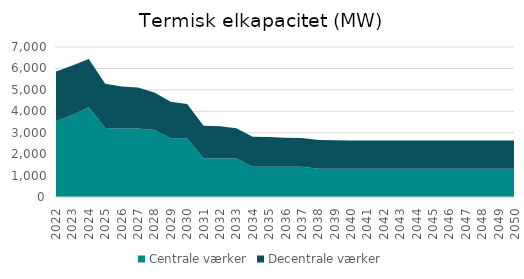
| Category | Centrale værker | Decentrale værker |
|---|---|---|
| 2022.0 | 3537.5 | 2320.3 |
| 2023.0 | 3832.5 | 2301.8 |
| 2024.0 | 4189.5 | 2244.79 |
| 2025.0 | 3221.2 | 2058.79 |
| 2026.0 | 3198 | 1956.52 |
| 2027.0 | 3198 | 1910.62 |
| 2028.0 | 3128 | 1746.25 |
| 2029.0 | 2743 | 1700.29 |
| 2030.0 | 2743 | 1602.05 |
| 2031.0 | 1798 | 1523.89 |
| 2032.0 | 1798 | 1499.86 |
| 2033.0 | 1798 | 1410.03 |
| 2034.0 | 1414 | 1398.12 |
| 2035.0 | 1414 | 1391.59 |
| 2036.0 | 1414 | 1355.06 |
| 2037.0 | 1414 | 1343.86 |
| 2038.0 | 1324 | 1333.43 |
| 2039.0 | 1324 | 1320.37 |
| 2040.0 | 1324 | 1308.49 |
| 2041.0 | 1324 | 1308.49 |
| 2042.0 | 1324 | 1308.49 |
| 2043.0 | 1324 | 1308.49 |
| 2044.0 | 1324 | 1308.49 |
| 2045.0 | 1324 | 1308.49 |
| 2046.0 | 1324 | 1308.49 |
| 2047.0 | 1324 | 1308.49 |
| 2048.0 | 1324 | 1308.49 |
| 2049.0 | 1324 | 1308.49 |
| 2050.0 | 1324 | 1308.49 |